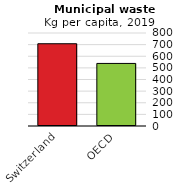
| Category | 2019 |
|---|---|
| Switzerland | 707.571 |
| OECD | 538.288 |